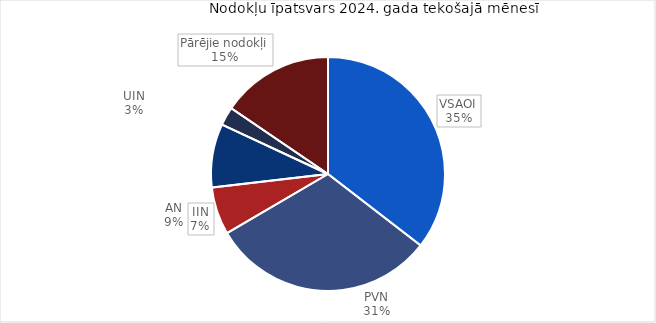
| Category | īpatsvars 2024 |
|---|---|
| VSAOI | 0.355 |
| PVN | 0.311 |
| IIN | 0.066 |
| AN | 0.088 |
| UIN | 0.026 |
| Pārējie nodokļi | 0.155 |